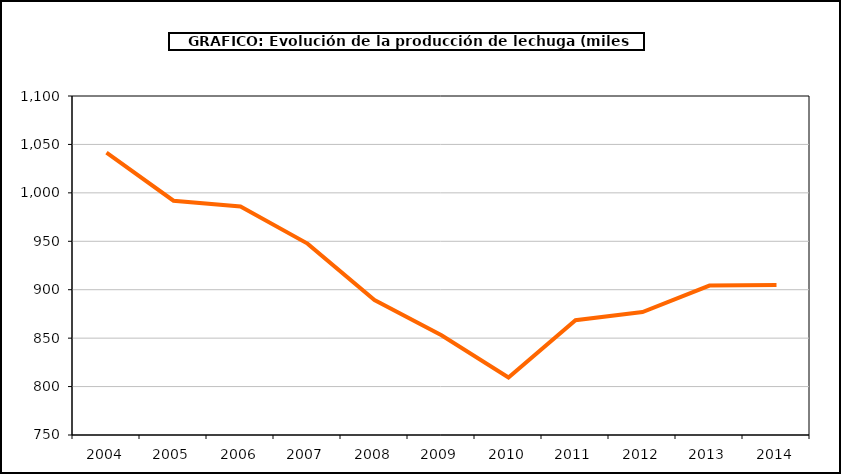
| Category | producción |
|---|---|
| 2004.0 | 1041.623 |
| 2005.0 | 991.873 |
| 2006.0 | 985.861 |
| 2007.0 | 947.612 |
| 2008.0 | 889.233 |
| 2009.0 | 852.988 |
| 2010.0 | 809.39 |
| 2011.0 | 868.436 |
| 2012.0 | 876.926 |
| 2013.0 | 904.283 |
| 2014.0 | 904.802 |